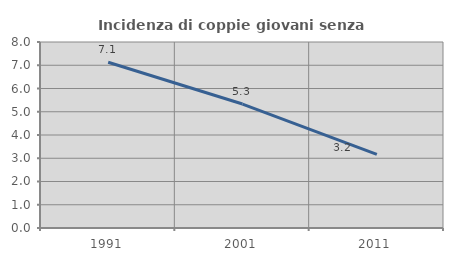
| Category | Incidenza di coppie giovani senza figli |
|---|---|
| 1991.0 | 7.127 |
| 2001.0 | 5.331 |
| 2011.0 | 3.169 |